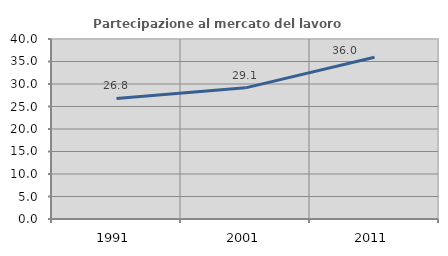
| Category | Partecipazione al mercato del lavoro  femminile |
|---|---|
| 1991.0 | 26.796 |
| 2001.0 | 29.146 |
| 2011.0 | 35.959 |